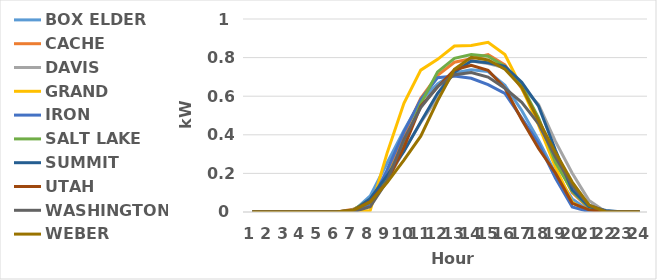
| Category | BOX ELDER | CACHE | DAVIS | GRAND | IRON | SALT LAKE | SUMMIT | UTAH | WASHINGTON | WEBER |
|---|---|---|---|---|---|---|---|---|---|---|
| 0 | 0 | 0 | 0 | 0 | 0 | 0 | 0 | 0 | 0 | 0 |
| 1 | 0 | 0 | 0 | 0 | 0 | 0 | 0 | 0 | 0 | 0 |
| 2 | 0 | 0 | 0 | 0 | 0 | 0 | 0 | 0 | 0 | 0 |
| 3 | 0 | 0 | 0 | 0 | 0 | 0 | 0 | 0 | 0 | 0 |
| 4 | 0 | 0 | 0 | 0 | 0 | 0 | 0 | 0 | 0 | 0 |
| 5 | 0 | 0 | 0 | 0 | 0 | 0 | 0 | 0 | 0 | 0 |
| 6 | 0.005 | 0.014 | 0.012 | 0 | 0 | 0.011 | 0.006 | 0.01 | 0.002 | 0.009 |
| 7 | 0.083 | 0.059 | 0.056 | 0.008 | 0.043 | 0.066 | 0.069 | 0.054 | 0.027 | 0.052 |
| 8 | 0.254 | 0.188 | 0.162 | 0.305 | 0.217 | 0.179 | 0.189 | 0.157 | 0.16 | 0.152 |
| 9 | 0.422 | 0.401 | 0.318 | 0.563 | 0.415 | 0.354 | 0.314 | 0.335 | 0.376 | 0.269 |
| 10 | 0.576 | 0.589 | 0.464 | 0.735 | 0.582 | 0.561 | 0.467 | 0.548 | 0.541 | 0.393 |
| 11 | 0.664 | 0.708 | 0.592 | 0.791 | 0.696 | 0.726 | 0.615 | 0.648 | 0.65 | 0.576 |
| 12 | 0.72 | 0.776 | 0.728 | 0.86 | 0.705 | 0.796 | 0.724 | 0.737 | 0.711 | 0.74 |
| 13 | 0.737 | 0.794 | 0.782 | 0.863 | 0.693 | 0.816 | 0.782 | 0.76 | 0.723 | 0.802 |
| 14 | 0.728 | 0.815 | 0.769 | 0.879 | 0.66 | 0.807 | 0.773 | 0.734 | 0.699 | 0.788 |
| 15 | 0.656 | 0.762 | 0.747 | 0.816 | 0.614 | 0.754 | 0.754 | 0.642 | 0.641 | 0.74 |
| 16 | 0.526 | 0.64 | 0.651 | 0.643 | 0.486 | 0.655 | 0.672 | 0.478 | 0.568 | 0.646 |
| 17 | 0.372 | 0.482 | 0.556 | 0.45 | 0.355 | 0.486 | 0.548 | 0.329 | 0.457 | 0.474 |
| 18 | 0.201 | 0.275 | 0.366 | 0.233 | 0.176 | 0.257 | 0.321 | 0.202 | 0.285 | 0.309 |
| 19 | 0.068 | 0.1 | 0.201 | 0.05 | 0.026 | 0.107 | 0.115 | 0.045 | 0.138 | 0.155 |
| 20 | 0.006 | 0.019 | 0.059 | 0.001 | 0.002 | 0.023 | 0.028 | 0.011 | 0.035 | 0.036 |
| 21 | 0 | 0 | 0 | 0 | 0 | 0.002 | 0.008 | 0 | 0.004 | 0 |
| 22 | 0 | 0 | 0 | 0 | 0 | 0 | 0 | 0 | 0 | 0 |
| 23 | 0 | 0 | 0 | 0 | 0 | 0 | 0 | 0 | 0 | 0 |